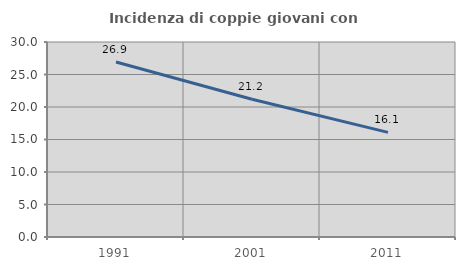
| Category | Incidenza di coppie giovani con figli |
|---|---|
| 1991.0 | 26.926 |
| 2001.0 | 21.188 |
| 2011.0 | 16.096 |